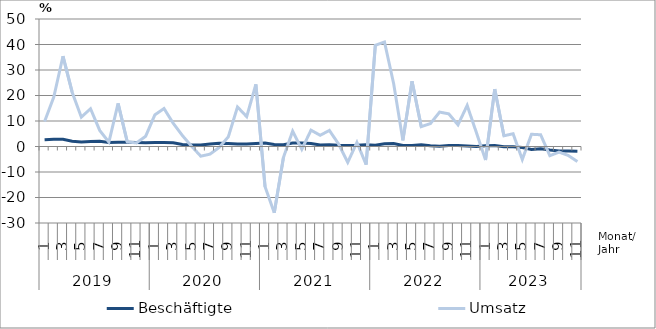
| Category | Beschäftigte | Umsatz |
|---|---|---|
| 0 | 2.6 | 9.8 |
| 1 | 2.8 | 19.4 |
| 2 | 2.8 | 35.4 |
| 3 | 2.1 | 21.3 |
| 4 | 1.8 | 11.5 |
| 5 | 2 | 14.8 |
| 6 | 2.1 | 6.3 |
| 7 | 1.6 | 1.7 |
| 8 | 1.7 | 16.9 |
| 9 | 1.7 | 1.8 |
| 10 | 1.6 | 1.4 |
| 11 | 1.5 | 4 |
| 12 | 1.6 | 12.4 |
| 13 | 1.6 | 14.9 |
| 14 | 1.5 | 9.1 |
| 15 | 0.8 | 4.3 |
| 16 | 0.6 | 0.1 |
| 17 | 0.6 | -3.8 |
| 18 | 1 | -3 |
| 19 | 1.3 | -0.4 |
| 20 | 1.2 | 3.8 |
| 21 | 1 | 15.5 |
| 22 | 1 | 11.7 |
| 23 | 1.2 | 24.4 |
| 24 | 1.4 | -15.8 |
| 25 | 0.8 | -26 |
| 26 | 0.7 | -4.3 |
| 27 | 1.4 | 6 |
| 28 | 1.4 | -1.1 |
| 29 | 1.2 | 6.4 |
| 30 | 0.6 | 4.4 |
| 31 | 0.7 | 6.3 |
| 32 | 0.5 | 1 |
| 33 | 0.4 | -6.2 |
| 34 | 0.5 | 1.6 |
| 35 | 0.7 | -7.1 |
| 36 | 0.5 | 39.7 |
| 37 | 1.1 | 41 |
| 38 | 1.2 | 24.6 |
| 39 | 0.4 | 2.4 |
| 40 | 0.4 | 25.6 |
| 41 | 0.7 | 7.8 |
| 42 | 0.3 | 9 |
| 43 | 0.1 | 13.5 |
| 44 | 0.4 | 12.8 |
| 45 | 0.4 | 8.5 |
| 46 | 0.2 | 16.1 |
| 47 | 0 | 5.5 |
| 48 | 0.3 | -5.3 |
| 49 | 0.4 | 22.5 |
| 50 | -0.1 | 4.2 |
| 51 | -0.1 | 5 |
| 52 | -0.4 | -5.1 |
| 53 | -1.2 | 4.8 |
| 54 | -0.9 | 4.6 |
| 55 | -1.4 | -3.6 |
| 56 | -1.8 | -2.2 |
| 57 | -1.8 | -3.5 |
| 58 | -1.9 | -5.9 |